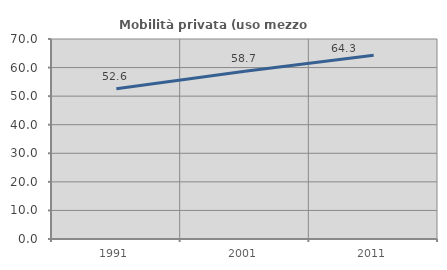
| Category | Mobilità privata (uso mezzo privato) |
|---|---|
| 1991.0 | 52.614 |
| 2001.0 | 58.683 |
| 2011.0 | 64.324 |